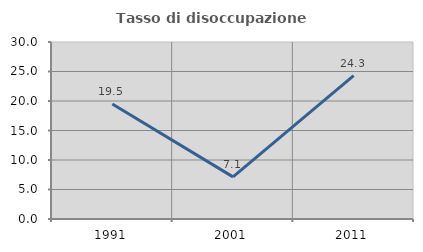
| Category | Tasso di disoccupazione giovanile  |
|---|---|
| 1991.0 | 19.492 |
| 2001.0 | 7.143 |
| 2011.0 | 24.286 |